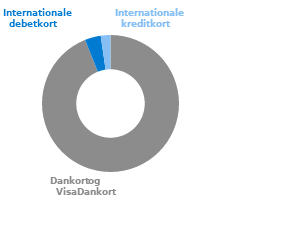
| Category | Series 0 |
|---|---|
| Dankort og VisaDankort | 93.947 |
| Internationale debetkort | 3.763 |
| Internationale kreditkort | 2.29 |